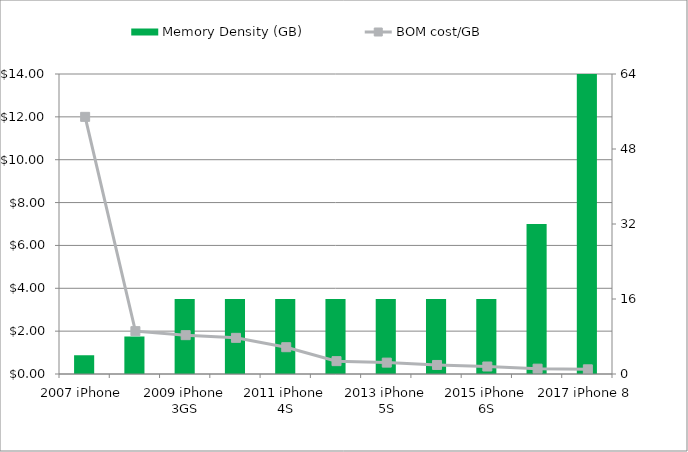
| Category | Memory Density (GB) |
|---|---|
| 2007 iPhone | 4 |
| 2008 iPhone 3G | 8 |
| 2009 iPhone 3GS | 16 |
| 2010 iPhone 4 | 16 |
| 2011 iPhone 4S | 16 |
| 2012 iPhone 5 | 16 |
| 2013 iPhone 5S | 16 |
| 2014 iPhone 6 | 16 |
| 2015 iPhone 6S | 16 |
| 2016 iPhone 7 | 32 |
| 2017 iPhone 8 | 64 |